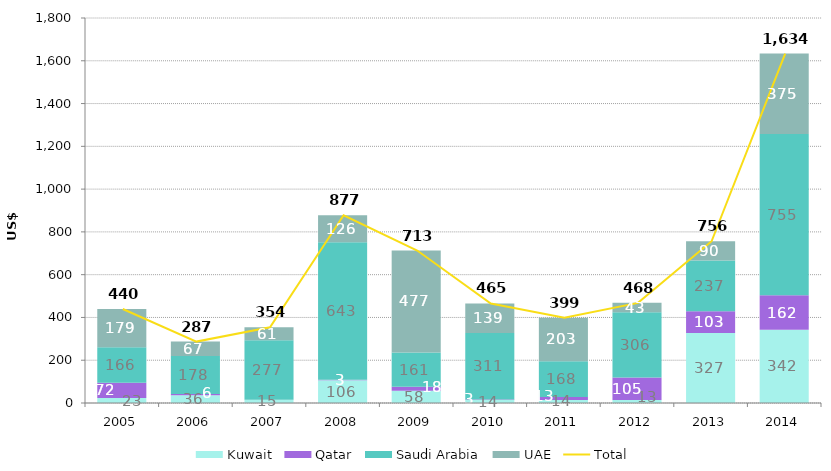
| Category | Kuwait | Qatar | Saudi Arabia | UAE |
|---|---|---|---|---|
| 2005.0 | 23.021 | 71.504 | 166.343 | 178.671 |
| 2006.0 | 35.835 | 6.498 | 177.776 | 66.969 |
| 2007.0 | 15.29 | 0.26 | 277.26 | 61.36 |
| 2008.0 | 105.916 | 2.803 | 643.083 | 125.651 |
| 2009.0 | 57.68 | 18.091 | 160.515 | 476.64 |
| 2010.0 | 13.592 | 2.6 | 310.626 | 138.571 |
| 2011.0 | 14.354 | 13.196 | 167.987 | 203.3 |
| 2012.0 | 13.456 | 105.417 | 305.913 | 43.4 |
| 2013.0 | 326.808 | 102.503 | 236.784 | 90.136 |
| 2014.0 | 341.894 | 161.761 | 754.52 | 375.49 |